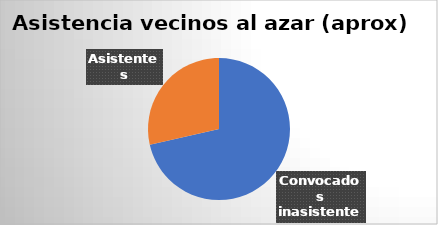
| Category | Series 0 |
|---|---|
| Convocados inasistentes | 15 |
| Asistentes | 6 |